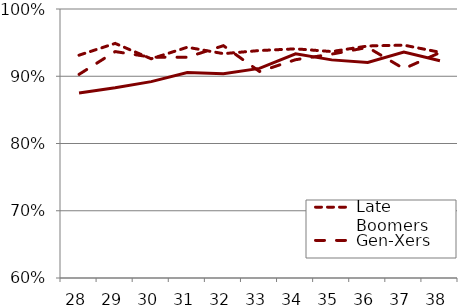
| Category | Late Boomers | Gen-Xers | Millennials |
|---|---|---|---|
| 28.0 | 0.931 | 0.903 | 0.875 |
| 29.0 | 0.949 | 0.937 | 0.883 |
| 30.0 | 0.926 | 0.928 | 0.892 |
| 31.0 | 0.943 | 0.928 | 0.906 |
| 32.0 | 0.934 | 0.945 | 0.904 |
| 33.0 | 0.938 | 0.907 | 0.912 |
| 34.0 | 0.941 | 0.925 | 0.933 |
| 35.0 | 0.937 | 0.933 | 0.924 |
| 36.0 | 0.945 | 0.943 | 0.921 |
| 37.0 | 0.946 | 0.911 | 0.936 |
| 38.0 | 0.936 | 0.935 | 0.923 |